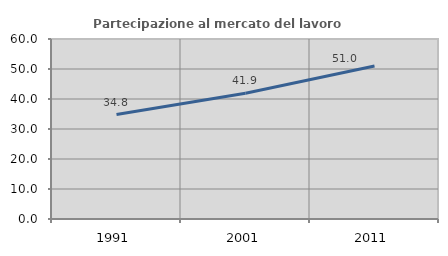
| Category | Partecipazione al mercato del lavoro  femminile |
|---|---|
| 1991.0 | 34.802 |
| 2001.0 | 41.887 |
| 2011.0 | 51.027 |